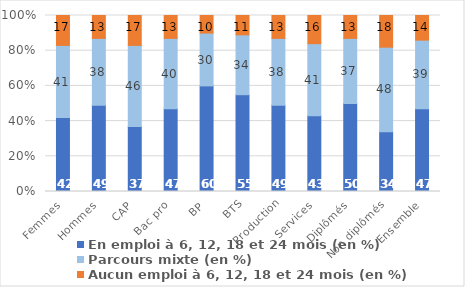
| Category | En emploi à 6, 12, 18 et 24 mois (en %) | Parcours mixte (en %) | Aucun emploi à 6, 12, 18 et 24 mois (en %) |
|---|---|---|---|
| Femmes | 42 | 41 | 17 |
| Hommes | 49 | 38 | 13 |
| CAP | 37 | 46 | 17 |
| Bac pro | 47 | 40 | 13 |
| BP | 60 | 30 | 10 |
| BTS | 55 | 34 | 11 |
| Production | 49 | 38 | 13 |
| Services | 43 | 41 | 16 |
| Diplômés | 50 | 37 | 13 |
| Non diplômés | 34 | 48 | 18 |
| Ensemble | 47 | 39 | 14 |